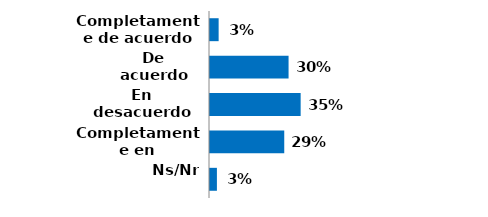
| Category | Series 0 |
|---|---|
| Completamente de acuerdo | 0.033 |
| De acuerdo | 0.303 |
| En desacuerdo | 0.35 |
| Completamente en desacuerdo | 0.287 |
| Ns/Nr | 0.027 |